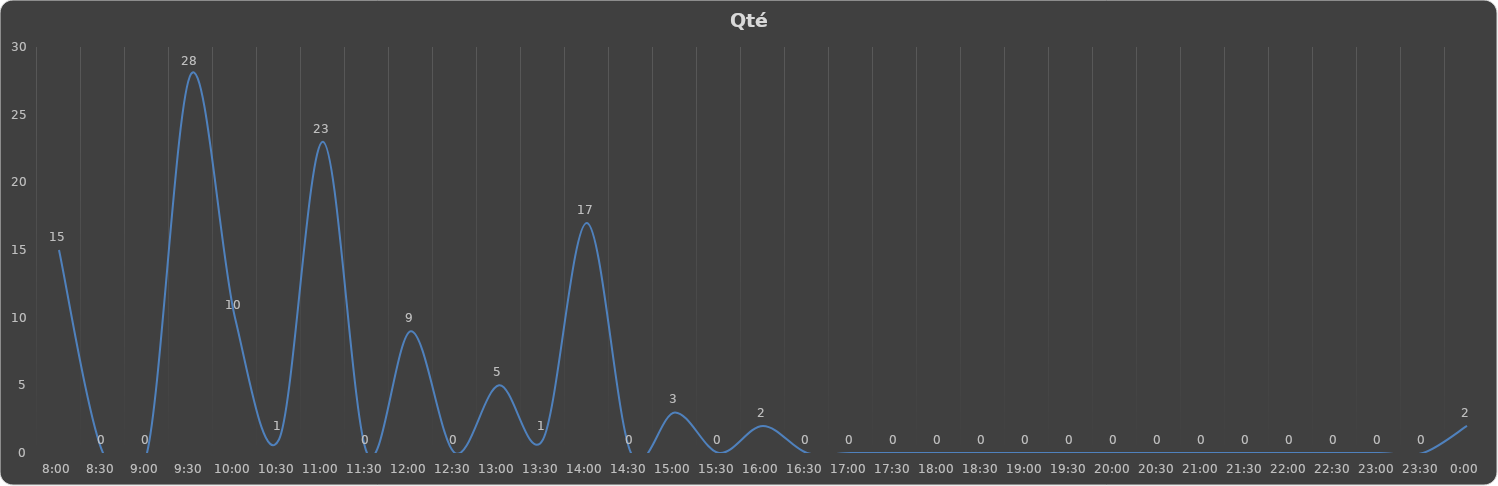
| Category | Qté Livrée |
|---|---|
| 0.3333333333333333 | 15 |
| 0.3541666666666667 | 0 |
| 0.375 | 0 |
| 0.395833333333333 | 28 |
| 0.416666666666667 | 10 |
| 0.4375 | 1 |
| 0.458333333333333 | 23 |
| 0.479166666666667 | 0 |
| 0.5 | 9 |
| 0.520833333333333 | 0 |
| 0.541666666666667 | 5 |
| 0.5625 | 1 |
| 0.583333333333333 | 17 |
| 0.604166666666667 | 0 |
| 0.625 | 3 |
| 0.645833333333334 | 0 |
| 0.666666666666667 | 2 |
| 0.6875 | 0 |
| 0.708333333333334 | 0 |
| 0.729166666666667 | 0 |
| 0.75 | 0 |
| 0.770833333333334 | 0 |
| 0.791666666666667 | 0 |
| 0.812500000000001 | 0 |
| 0.833333333333334 | 0 |
| 0.854166666666667 | 0 |
| 0.875000000000001 | 0 |
| 0.895833333333334 | 0 |
| 0.916666666666667 | 0 |
| 0.937500000000001 | 0 |
| 0.958333333333334 | 0 |
| 0.979166666666667 | 0 |
| 1900-01-01 | 2 |